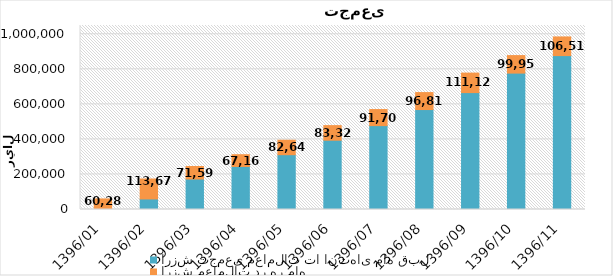
| Category | ارزش تجمعی معاملات تا انتهای ماه قبل | ارزش معاملات در هر ماه |
|---|---|---|
| 1396/01 | 0 | 60288 |
| 1396/02 | 60288 | 113671 |
| 1396/03 | 173959 | 71591 |
| 1396/04 | 245550 | 67162 |
| 1396/05 | 312712 | 82645 |
| 1396/06 | 395357 | 83323 |
| 1396/07 | 478680 | 91706 |
| 1396/08 | 570386 | 96819 |
| 1396/09 | 667205 | 111126 |
| 1396/10 | 778331 | 99950 |
| 1396/11 | 878281 | 106515 |